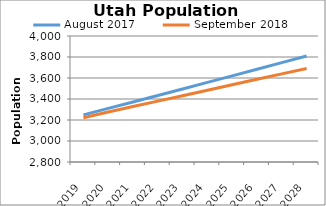
| Category | August 2017 | September 2018 |
|---|---|---|
| 2019.0 | 3249.147 | 3221.446 |
| 2020.0 | 3310.646 | 3275.672 |
| 2021.0 | 3372.082 | 3328.185 |
| 2022.0 | 3433.807 | 3379.692 |
| 2023.0 | 3495.807 | 3431.349 |
| 2024.0 | 3558.086 | 3483.249 |
| 2025.0 | 3620.637 | 3535.268 |
| 2026.0 | 3683.494 | 3587.308 |
| 2027.0 | 3746.625 | 3639.25 |
| 2028.0 | 3810.002 | 3691.019 |